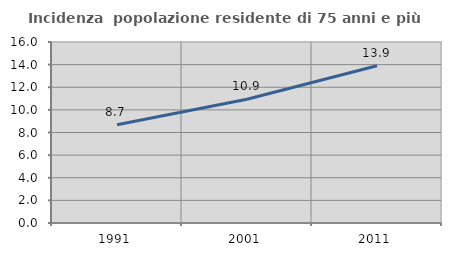
| Category | Incidenza  popolazione residente di 75 anni e più |
|---|---|
| 1991.0 | 8.684 |
| 2001.0 | 10.934 |
| 2011.0 | 13.907 |